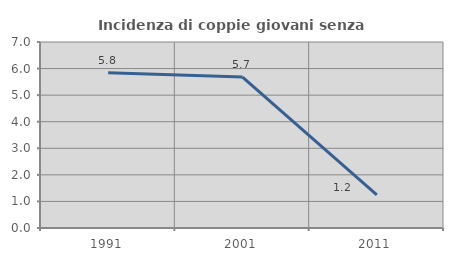
| Category | Incidenza di coppie giovani senza figli |
|---|---|
| 1991.0 | 5.842 |
| 2001.0 | 5.678 |
| 2011.0 | 1.242 |